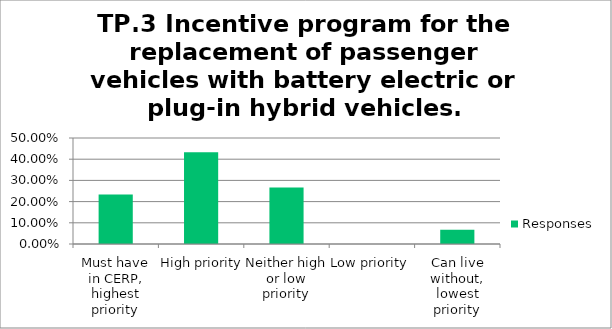
| Category | Responses |
|---|---|
| Must have in CERP, highest priority | 0.233 |
| High priority | 0.433 |
| Neither high or low priority | 0.267 |
| Low priority | 0 |
| Can live without, lowest priority | 0.067 |